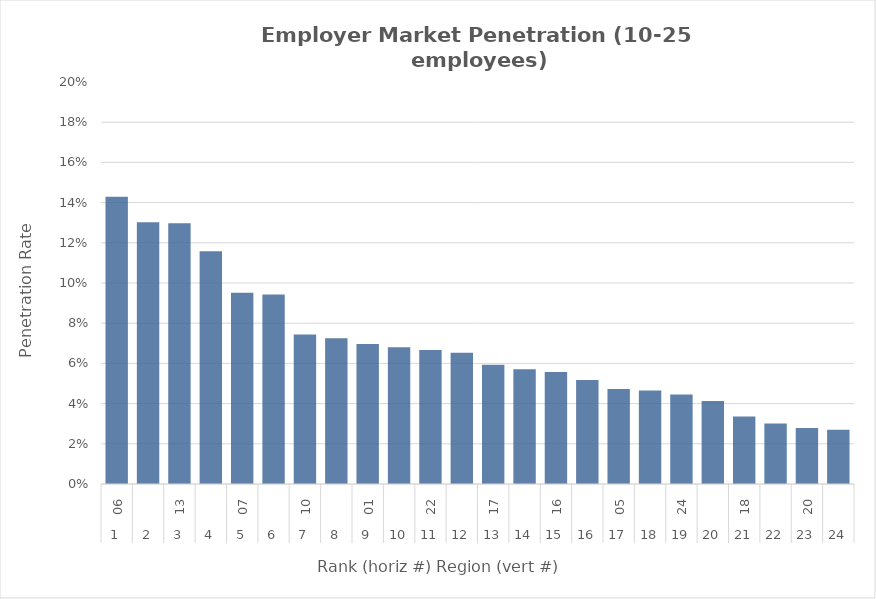
| Category | Rate |
|---|---|
| 0 | 0.143 |
| 1 | 0.13 |
| 2 | 0.13 |
| 3 | 0.116 |
| 4 | 0.095 |
| 5 | 0.094 |
| 6 | 0.074 |
| 7 | 0.073 |
| 8 | 0.07 |
| 9 | 0.068 |
| 10 | 0.067 |
| 11 | 0.065 |
| 12 | 0.059 |
| 13 | 0.057 |
| 14 | 0.056 |
| 15 | 0.052 |
| 16 | 0.047 |
| 17 | 0.046 |
| 18 | 0.045 |
| 19 | 0.041 |
| 20 | 0.034 |
| 21 | 0.03 |
| 22 | 0.028 |
| 23 | 0.027 |